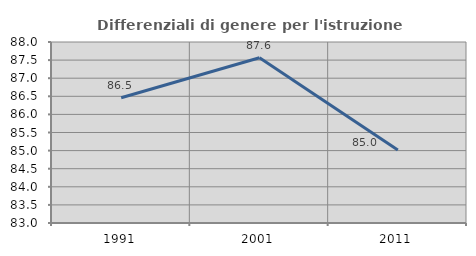
| Category | Differenziali di genere per l'istruzione superiore |
|---|---|
| 1991.0 | 86.458 |
| 2001.0 | 87.565 |
| 2011.0 | 85.02 |